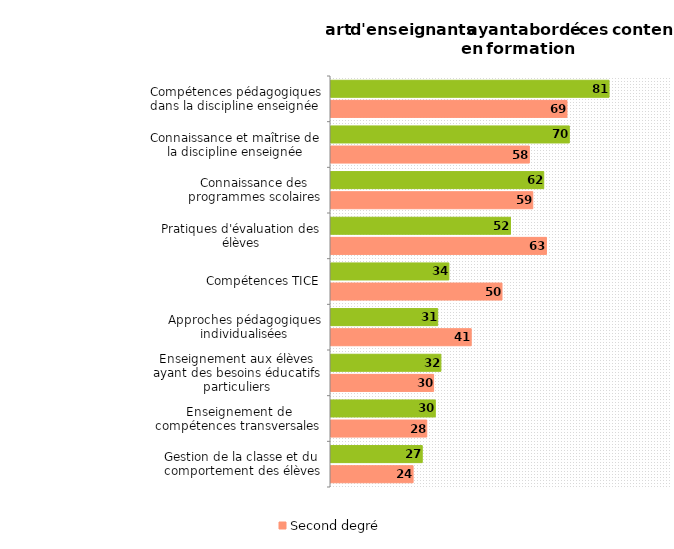
| Category | Premier degré | Second degré |
|---|---|---|
| Compétences pédagogiques dans la discipline enseignée | 81.304 | 69 |
| Connaissance et maîtrise de la discipline enseignée | 69.686 | 58 |
| Connaissance des programmes scolaires | 62.2 | 59 |
| Pratiques d'évaluation des élèves | 52.479 | 63 |
| Compétences TICE | 34.469 | 50 |
| Approches pédagogiques individualisées | 31.192 | 41 |
| Enseignement aux élèves ayant des besoins éducatifs particuliers | 32.13 | 30 |
| Enseignement de compétences transversales | 30.499 | 28 |
| Gestion de la classe et du comportement des élèves | 26.684 | 24 |